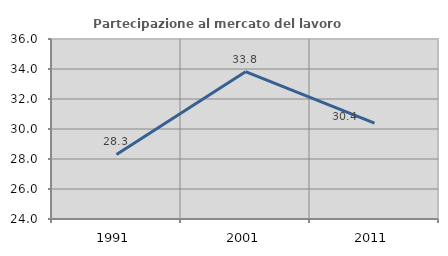
| Category | Partecipazione al mercato del lavoro  femminile |
|---|---|
| 1991.0 | 28.305 |
| 2001.0 | 33.822 |
| 2011.0 | 30.388 |